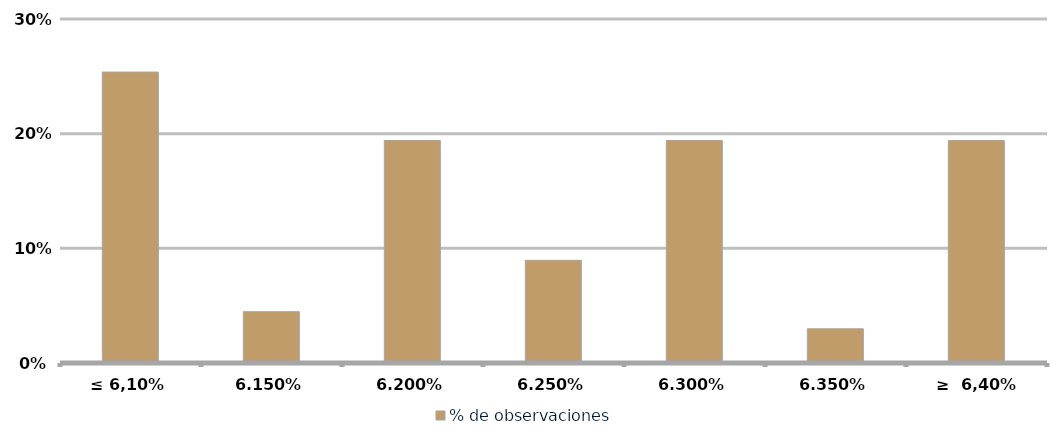
| Category | % de observaciones  |
|---|---|
| ≤ 6,10% | 0.254 |
| 6,15% | 0.045 |
| 6,20% | 0.194 |
| 6,25% | 0.09 |
| 6,30% | 0.194 |
| 6,35% | 0.03 |
| ≥  6,40% | 0.194 |